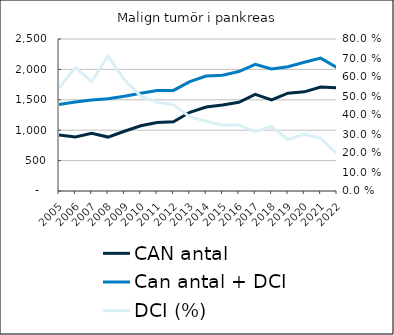
| Category |  CAN antal  |  Can antal + DCI  |
|---|---|---|
| 2005.0 | 922 | 1421 |
| 2006.0 | 888 | 1465 |
| 2007.0 | 950 | 1497 |
| 2008.0 | 887 | 1517 |
| 2009.0 | 983 | 1558 |
| 2010.0 | 1073 | 1609 |
| 2011.0 | 1126 | 1652 |
| 2012.0 | 1137 | 1654 |
| 2013.0 | 1294 | 1799 |
| 2014.0 | 1382 | 1890 |
| 2015.0 | 1414 | 1904 |
| 2016.0 | 1458 | 1965 |
| 2017.0 | 1588 | 2084 |
| 2018.0 | 1499 | 2008 |
| 2019.0 | 1608 | 2044 |
| 2020.0 | 1631 | 2118 |
| 2021.0 | 1711 | 2185 |
| 2022.0 | 1698 | 2031 |